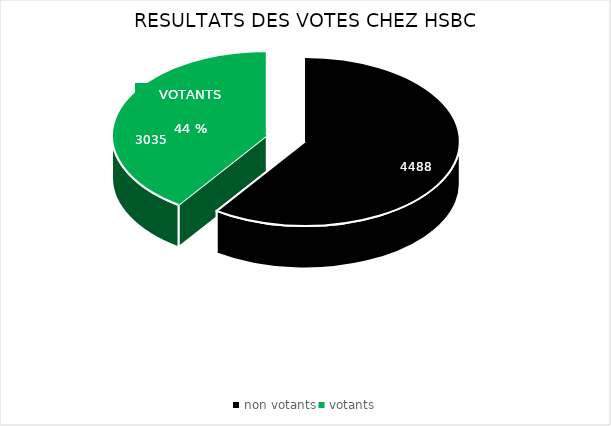
| Category | Series 0 |
|---|---|
| non votants | 4488 |
| votants | 3035 |